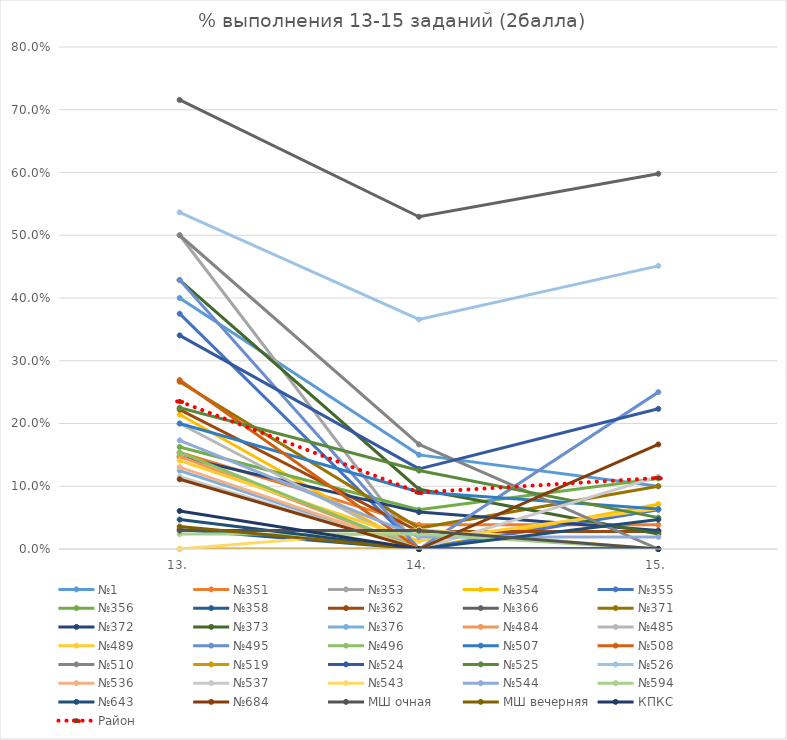
| Category | №1 | №351 | №353 | №354 | №355 | №356 | №358 | №362 | №366 | №371 | №372 | №373 | №376 | №484 | №485 | №489 | №495 | №496 | №507 | №508 | №510 | №519 | №524 | №525 | №526 | №536 | №537 | №543 | №544 | №594 | №643 | №684 | МШ очная | МШ вечерняя | КПКС | Район |
|---|---|---|---|---|---|---|---|---|---|---|---|---|---|---|---|---|---|---|---|---|---|---|---|---|---|---|---|---|---|---|---|---|---|---|---|---|
| 13. | 0.4 | 0.154 | 0.5 | 0.214 | 0.375 | 0.162 | 0.031 | 0.222 | 0.716 | 0.267 | 0.147 | 0.429 | 0.125 | 0.148 | 0.2 | 0.141 | 0.429 | 0.154 | 0.2 | 0.269 | 0.5 | 0 | 0.34 | 0.225 | 0.537 | 0.13 | 0.115 | 0 | 0.173 | 0.024 | 0.047 | 0.111 | 0.029 | 0.036 | 0.061 | 0.235 |
| 14. | 0.15 | 0.038 | 0 | 0 | 0 | 0.062 | 0 | 0.028 | 0.529 | 0.033 | 0.059 | 0.095 | 0 | 0 | 0 | 0.013 | 0 | 0 | 0.091 | 0 | 0.167 | 0 | 0.128 | 0.125 | 0.366 | 0 | 0 | 0.031 | 0.019 | 0.024 | 0 | 0 | 0.029 | 0 | 0 | 0.09 |
| 15. | 0.1 | 0.038 | 0 | 0.071 | 0.062 | 0.112 | 0 | 0.028 | 0.598 | 0.1 | 0.029 | 0.024 | 0 | 0 | 0 | 0.064 | 0.25 | 0 | 0.064 | 0 | 0 | 0 | 0.223 | 0.05 | 0.451 | 0 | 0.115 | 0 | 0.019 | 0 | 0.047 | 0.167 | 0 | 0 | 0 | 0.113 |